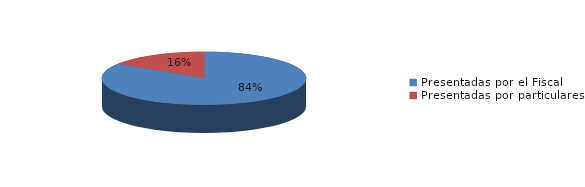
| Category | Series 0 |
|---|---|
| Presentadas por el Fiscal | 364 |
| Presentadas por particulares | 69 |